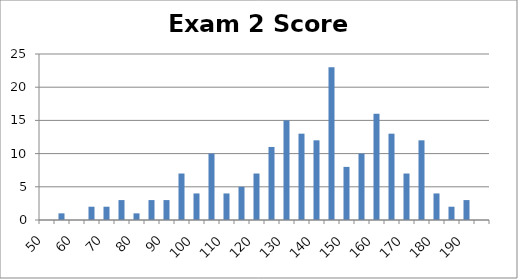
| Category | Frequency |
|---|---|
| 50 | 0 |
| 55 | 1 |
| 60 | 0 |
| 65 | 2 |
| 70 | 2 |
| 75 | 3 |
| 80 | 1 |
| 85 | 3 |
| 90 | 3 |
| 95 | 7 |
| 100 | 4 |
| 105 | 10 |
| 110 | 4 |
| 115 | 5 |
| 120 | 7 |
| 125 | 11 |
| 130 | 15 |
| 135 | 13 |
| 140 | 12 |
| 145 | 23 |
| 150 | 8 |
| 155 | 10 |
| 160 | 16 |
| 165 | 13 |
| 170 | 7 |
| 175 | 12 |
| 180 | 4 |
| 185 | 2 |
| 190 | 3 |
| More | 0 |